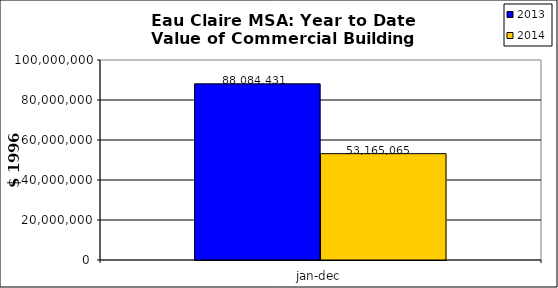
| Category | 2013 | 2014 |
|---|---|---|
| 0 | 88084431 | 53165065.482 |